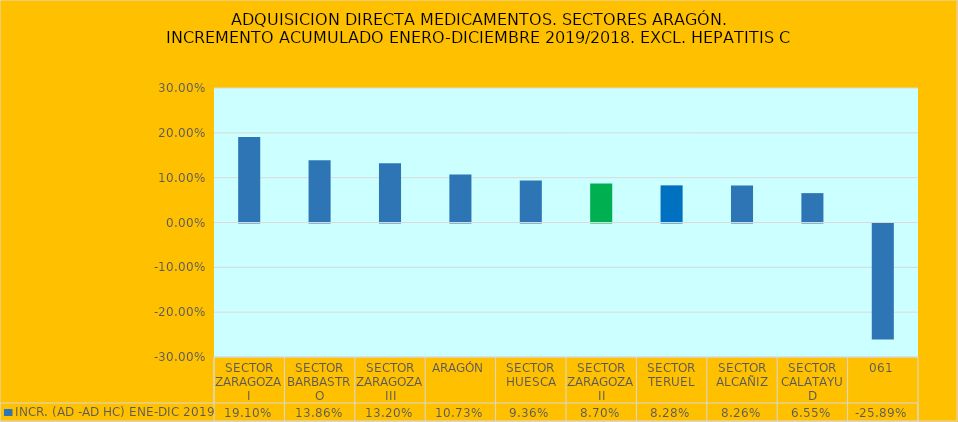
| Category | INCR. (AD -AD HC) ENE-DIC 2019 |
|---|---|
| SECTOR ZARAGOZA I | 0.191 |
| SECTOR BARBASTRO | 0.139 |
| SECTOR ZARAGOZA III | 0.132 |
| ARAGÓN | 0.107 |
| SECTOR HUESCA | 0.094 |
| SECTOR ZARAGOZA II | 0.087 |
| SECTOR TERUEL | 0.083 |
| SECTOR ALCAÑIZ | 0.083 |
| SECTOR CALATAYUD | 0.066 |
| 061 | -0.259 |